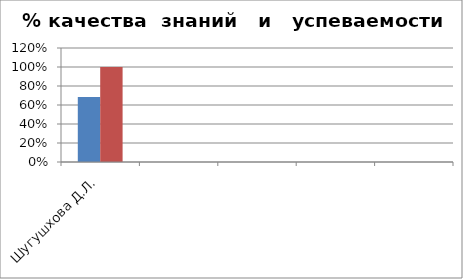
| Category | Series 0 | 2 |
|---|---|---|
| Шугушхова Д.Л. | 0.684 | 1 |